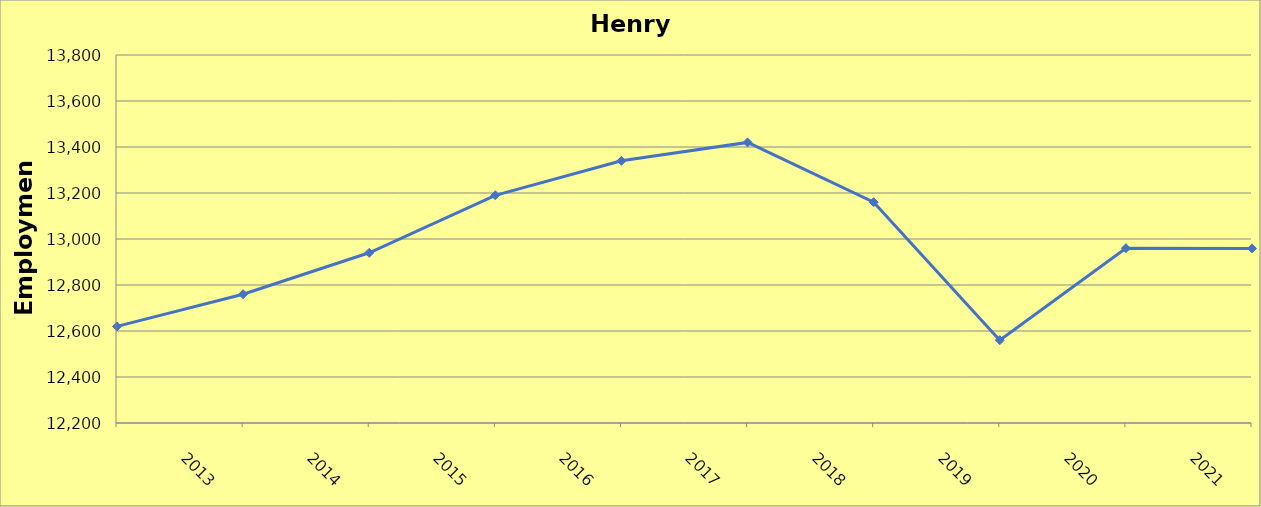
| Category | Henry County |
|---|---|
| 2013.0 | 12620 |
| 2014.0 | 12760 |
| 2015.0 | 12940 |
| 2016.0 | 13190 |
| 2017.0 | 13340 |
| 2018.0 | 13420 |
| 2019.0 | 13160 |
| 2020.0 | 12560 |
| 2021.0 | 12960 |
| 2022.0 | 12959 |